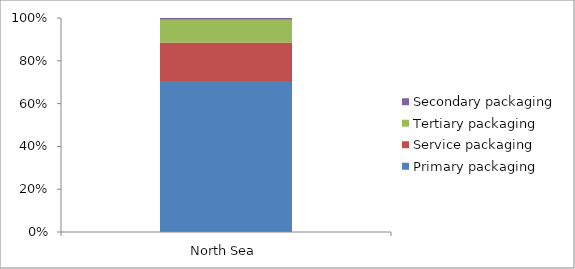
| Category | Primary packaging | Service packaging | Tertiary packaging | Secondary packaging |
|---|---|---|---|---|
| North Sea | 15265 | 3885 | 2319 | 167 |